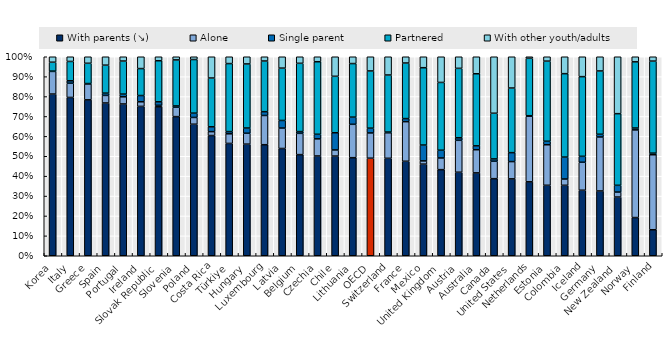
| Category | With parents (↘) | Alone | Single parent | Partnered | With other youth/adults |
|---|---|---|---|---|---|
| Korea | 0.813 | 0.114 | 0.001 | 0.045 | 0.027 |
| Italy | 0.795 | 0.071 | 0.012 | 0.097 | 0.024 |
| Greece | 0.783 | 0.08 | 0.002 | 0.102 | 0.033 |
| Spain | 0.768 | 0.038 | 0.011 | 0.141 | 0.042 |
| Portugal | 0.763 | 0.036 | 0.014 | 0.166 | 0.022 |
| Ireland | 0.751 | 0.023 | 0.031 | 0.135 | 0.059 |
| Slovak Republic | 0.749 | 0.007 | 0.018 | 0.206 | 0.02 |
| Slovenia | 0.699 | 0.047 | 0.006 | 0.231 | 0.016 |
| Poland | 0.661 | 0.034 | 0.022 | 0.27 | 0.014 |
| Costa Rica | 0.604 | 0.02 | 0.024 | 0.245 | 0.107 |
| Türkiye | 0.564 | 0.048 | 0.011 | 0.342 | 0.034 |
| Hungary | 0.561 | 0.055 | 0.026 | 0.322 | 0.036 |
| Luxembourg | 0.558 | 0.147 | 0.019 | 0.255 | 0.021 |
| Latvia | 0.539 | 0.103 | 0.038 | 0.263 | 0.057 |
| Belgium | 0.508 | 0.107 | 0.009 | 0.343 | 0.033 |
| Czechia | 0.501 | 0.086 | 0.023 | 0.365 | 0.025 |
| Chile | 0.501 | 0.031 | 0.086 | 0.284 | 0.098 |
| Lithuania | 0.493 | 0.168 | 0.036 | 0.269 | 0.034 |
| OECD | 0.49 | 0.127 | 0.024 | 0.288 | 0.071 |
| Switzerland | 0.49 | 0.128 | 0.004 | 0.287 | 0.092 |
| France | 0.475 | 0.199 | 0.016 | 0.279 | 0.031 |
| Mexico | 0.46 | 0.016 | 0.08 | 0.389 | 0.055 |
| United Kingdom | 0.433 | 0.059 | 0.039 | 0.341 | 0.129 |
| Austria | 0.42 | 0.16 | 0.013 | 0.349 | 0.058 |
| Australia | 0.416 | 0.116 | 0.02 | 0.362 | 0.085 |
| Canada | 0.387 | 0.088 | 0.011 | 0.23 | 0.284 |
| United States | 0.386 | 0.087 | 0.045 | 0.325 | 0.157 |
| Netherlands | 0.371 | 0.329 | 0.003 | 0.288 | 0.008 |
| Estonia | 0.354 | 0.204 | 0.018 | 0.403 | 0.022 |
| Colombia | 0.354 | 0.032 | 0.11 | 0.419 | 0.085 |
| Iceland | 0.329 | 0.141 | 0.03 | 0.4 | 0.1 |
| Germany | 0.326 | 0.271 | 0.014 | 0.318 | 0.071 |
| New Zealand | 0.295 | 0.025 | 0.034 | 0.36 | 0.286 |
| Norway | 0.192 | 0.44 | 0.01 | 0.333 | 0.026 |
| Finland | 0.131 | 0.377 | 0.008 | 0.463 | 0.022 |